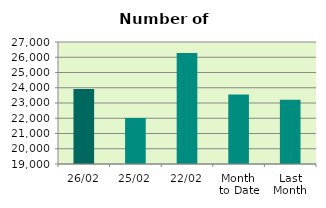
| Category | Series 0 |
|---|---|
| 26/02 | 23910 |
| 25/02 | 22018 |
| 22/02 | 26278 |
| Month 
to Date | 23558.778 |
| Last
Month | 23217.273 |